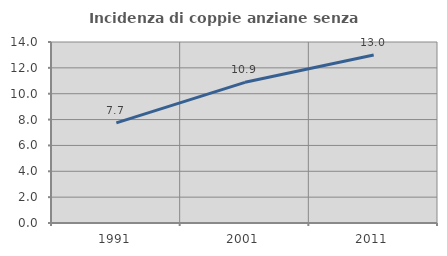
| Category | Incidenza di coppie anziane senza figli  |
|---|---|
| 1991.0 | 7.742 |
| 2001.0 | 10.882 |
| 2011.0 | 12.997 |